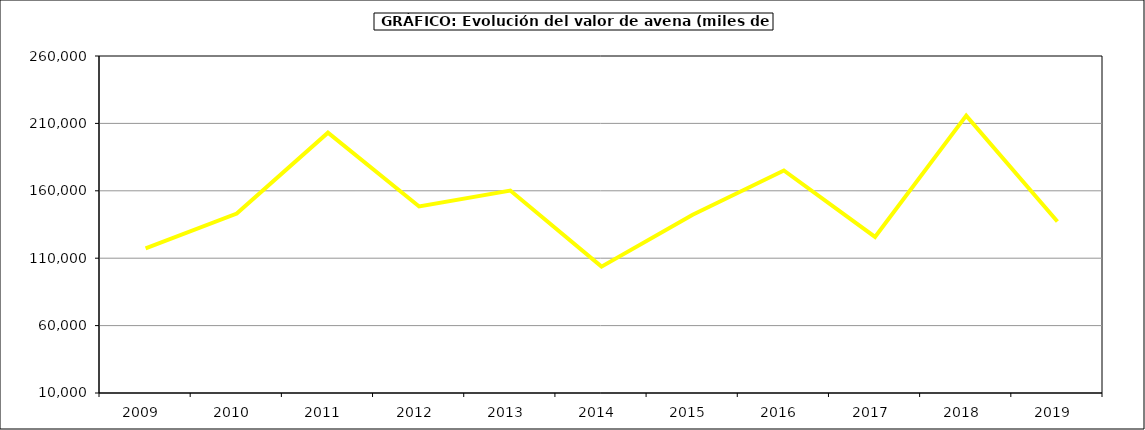
| Category | Valor |
|---|---|
| 2009.0 | 117248.747 |
| 2010.0 | 143145.142 |
| 2011.0 | 203137.341 |
| 2012.0 | 148383.942 |
| 2013.0 | 160216.853 |
| 2014.0 | 103741 |
| 2015.0 | 142229 |
| 2016.0 | 175065 |
| 2017.0 | 125814.243 |
| 2018.0 | 215756.155 |
| 2019.0 | 137250.359 |